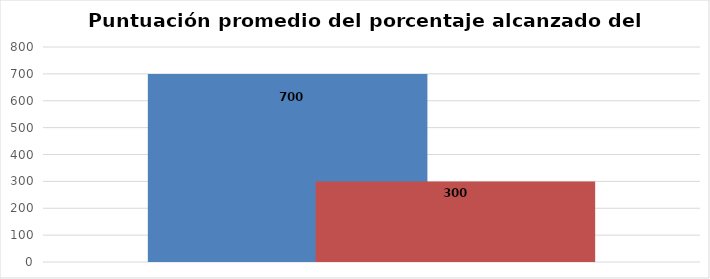
| Category | Series 0 | Series 1 |
|---|---|---|
| 0 | 700 | 300 |